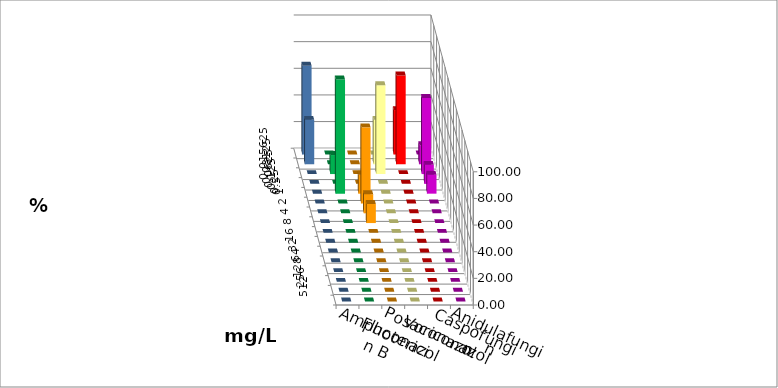
| Category | Amphotericin B | Fluconazol | Posaconazol | Voriconazol | Caspofungin | Anidulafungin |
|---|---|---|---|---|---|---|
| 0.015625 | 0 | 0 | 0 | 33.333 | 0 | 66.667 |
| 0.03125 | 0 | 0 | 33.333 | 66.667 | 14.286 | 33.333 |
| 0.0625 | 14.286 | 0 | 66.667 | 0 | 57.143 | 0 |
| 0.125 | 0 | 0 | 0 | 0 | 14.286 | 0 |
| 0.25 | 85.714 | 14.286 | 0 | 0 | 14.286 | 0 |
| 0.5 | 0 | 57.143 | 0 | 0 | 0 | 0 |
| 1.0 | 0 | 14.286 | 0 | 0 | 0 | 0 |
| 2.0 | 0 | 14.286 | 0 | 0 | 0 | 0 |
| 4.0 | 0 | 0 | 0 | 0 | 0 | 0 |
| 8.0 | 0 | 0 | 0 | 0 | 0 | 0 |
| 16.0 | 0 | 0 | 0 | 0 | 0 | 0 |
| 32.0 | 0 | 0 | 0 | 0 | 0 | 0 |
| 64.0 | 0 | 0 | 0 | 0 | 0 | 0 |
| 128.0 | 0 | 0 | 0 | 0 | 0 | 0 |
| 256.0 | 0 | 0 | 0 | 0 | 0 | 0 |
| 512.0 | 0 | 0 | 0 | 0 | 0 | 0 |